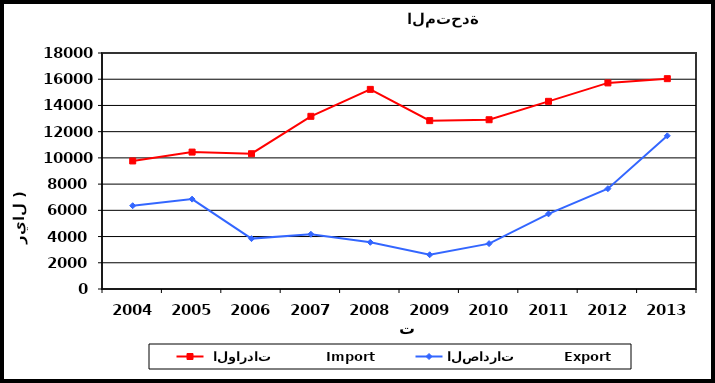
| Category |  الواردات           Import | الصادرات          Export |
|---|---|---|
| 2004.0 | 9767 | 6353 |
| 2005.0 | 10443 | 6855 |
| 2006.0 | 10318 | 3843 |
| 2007.0 | 13170 | 4175 |
| 2008.0 | 15225 | 3562 |
| 2009.0 | 12842 | 2612 |
| 2010.0 | 12909 | 3461 |
| 2011.0 | 14313 | 5730 |
| 2012.0 | 15719 | 7652 |
| 2013.0 | 16043 | 11683 |